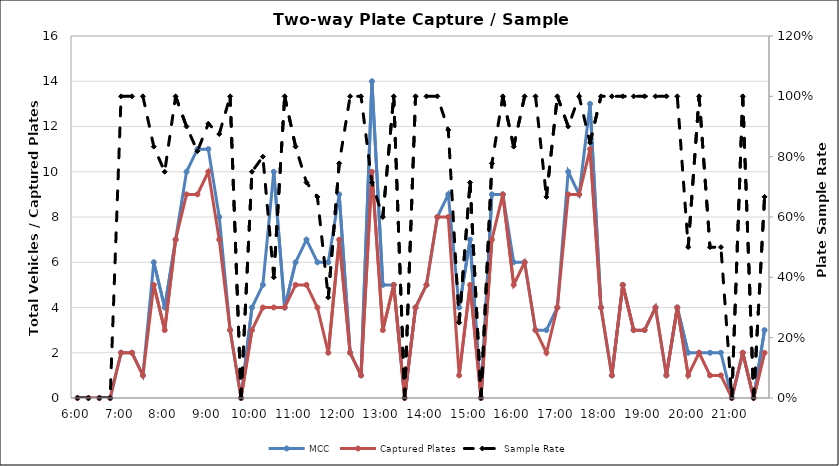
| Category | MCC | Captured Plates |
|---|---|---|
| 0.25 | 0 | 0 |
| 0.260416666666667 | 0 | 0 |
| 0.270833333333333 | 0 | 0 |
| 0.28125 | 0 | 0 |
| 0.291666666666667 | 2 | 2 |
| 0.302083333333333 | 2 | 2 |
| 0.3125 | 1 | 1 |
| 0.322916666666667 | 6 | 5 |
| 0.333333333333333 | 4 | 3 |
| 0.34375 | 7 | 7 |
| 0.354166666666667 | 10 | 9 |
| 0.364583333333333 | 11 | 9 |
| 0.375 | 11 | 10 |
| 0.385416666666667 | 8 | 7 |
| 0.395833333333333 | 3 | 3 |
| 0.40625 | 0 | 0 |
| 0.416666666666667 | 4 | 3 |
| 0.427083333333333 | 5 | 4 |
| 0.4375 | 10 | 4 |
| 0.447916666666667 | 4 | 4 |
| 0.458333333333333 | 6 | 5 |
| 0.46875 | 7 | 5 |
| 0.479166666666667 | 6 | 4 |
| 0.489583333333333 | 6 | 2 |
| 0.5 | 9 | 7 |
| 0.510416666666667 | 2 | 2 |
| 0.520833333333333 | 1 | 1 |
| 0.53125 | 14 | 10 |
| 0.541666666666667 | 5 | 3 |
| 0.552083333333333 | 5 | 5 |
| 0.5625 | 0 | 0 |
| 0.572916666666667 | 4 | 4 |
| 0.583333333333333 | 5 | 5 |
| 0.59375 | 8 | 8 |
| 0.604166666666667 | 9 | 8 |
| 0.614583333333333 | 4 | 1 |
| 0.625 | 7 | 5 |
| 0.635416666666667 | 0 | 0 |
| 0.645833333333333 | 9 | 7 |
| 0.65625 | 9 | 9 |
| 0.666666666666667 | 6 | 5 |
| 0.677083333333333 | 6 | 6 |
| 0.6875 | 3 | 3 |
| 0.697916666666667 | 3 | 2 |
| 0.708333333333333 | 4 | 4 |
| 0.71875 | 10 | 9 |
| 0.729166666666667 | 9 | 9 |
| 0.739583333333333 | 13 | 11 |
| 0.75 | 4 | 4 |
| 0.760416666666667 | 1 | 1 |
| 0.770833333333333 | 5 | 5 |
| 0.78125 | 3 | 3 |
| 0.791666666666667 | 3 | 3 |
| 0.802083333333333 | 4 | 4 |
| 0.8125 | 1 | 1 |
| 0.822916666666667 | 4 | 4 |
| 0.833333333333333 | 2 | 1 |
| 0.84375 | 2 | 2 |
| 0.854166666666667 | 2 | 1 |
| 0.864583333333333 | 2 | 1 |
| 0.875 | 0 | 0 |
| 0.885416666666667 | 2 | 2 |
| 0.895833333333333 | 0 | 0 |
| 0.90625 | 3 | 2 |